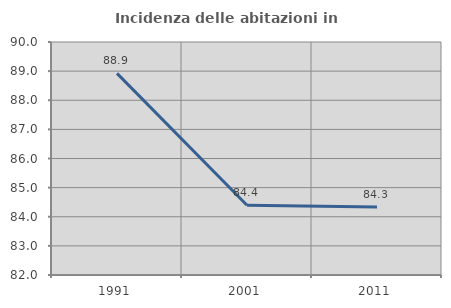
| Category | Incidenza delle abitazioni in proprietà  |
|---|---|
| 1991.0 | 88.922 |
| 2001.0 | 84.395 |
| 2011.0 | 84.333 |